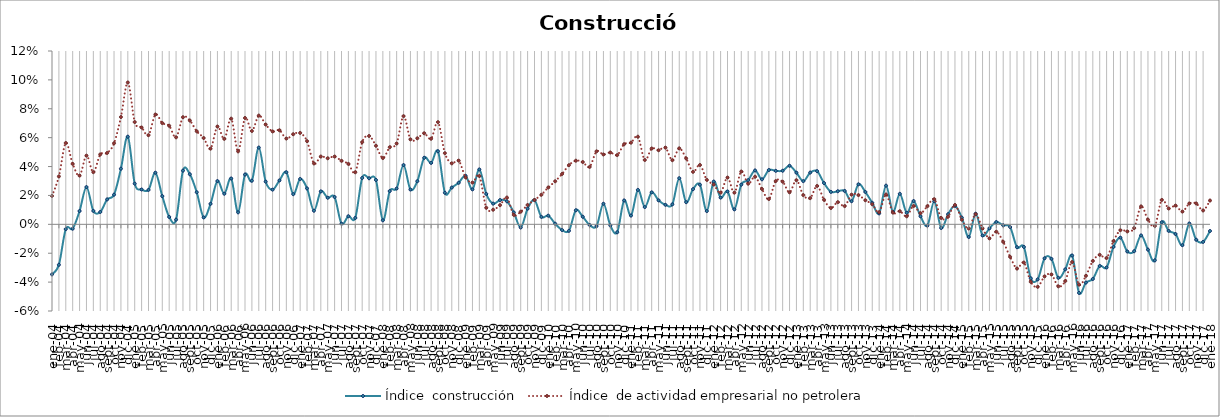
| Category | Índice  construcción | Índice  de actividad empresarial no petrolera |
|---|---|---|
| 2004-01-01 | -0.035 | 0.02 |
| 2004-02-01 | -0.028 | 0.033 |
| 2004-03-01 | -0.003 | 0.056 |
| 2004-04-01 | -0.003 | 0.042 |
| 2004-05-01 | 0.009 | 0.034 |
| 2004-06-01 | 0.026 | 0.048 |
| 2004-07-01 | 0.009 | 0.036 |
| 2004-08-01 | 0.009 | 0.048 |
| 2004-09-01 | 0.017 | 0.049 |
| 2004-10-01 | 0.021 | 0.056 |
| 2004-11-01 | 0.039 | 0.074 |
| 2004-12-01 | 0.061 | 0.098 |
| 2005-01-01 | 0.028 | 0.071 |
| 2005-02-01 | 0.024 | 0.067 |
| 2005-03-01 | 0.024 | 0.062 |
| 2005-04-01 | 0.036 | 0.076 |
| 2005-05-01 | 0.02 | 0.07 |
| 2005-06-01 | 0.005 | 0.068 |
| 2005-07-01 | 0.003 | 0.06 |
| 2005-08-01 | 0.037 | 0.074 |
| 2005-09-01 | 0.035 | 0.072 |
| 2005-10-01 | 0.022 | 0.064 |
| 2005-11-01 | 0.005 | 0.06 |
| 2005-12-01 | 0.014 | 0.052 |
| 2006-01-01 | 0.03 | 0.068 |
| 2006-02-01 | 0.021 | 0.059 |
| 2006-03-01 | 0.032 | 0.073 |
| 2006-04-01 | 0.008 | 0.051 |
| 2006-05-01 | 0.034 | 0.074 |
| 2006-06-01 | 0.03 | 0.065 |
| 2006-07-01 | 0.053 | 0.075 |
| 2006-08-01 | 0.03 | 0.069 |
| 2006-09-01 | 0.024 | 0.064 |
| 2006-10-01 | 0.03 | 0.065 |
| 2006-11-01 | 0.036 | 0.059 |
| 2006-12-01 | 0.021 | 0.062 |
| 2007-01-01 | 0.031 | 0.063 |
| 2007-02-01 | 0.025 | 0.058 |
| 2007-03-01 | 0.009 | 0.042 |
| 2007-04-01 | 0.023 | 0.047 |
| 2007-05-01 | 0.018 | 0.046 |
| 2007-06-01 | 0.019 | 0.047 |
| 2007-07-01 | 0 | 0.044 |
| 2007-08-01 | 0.006 | 0.042 |
| 2007-09-01 | 0.004 | 0.036 |
| 2007-10-01 | 0.032 | 0.057 |
| 2007-11-01 | 0.032 | 0.061 |
| 2007-12-01 | 0.031 | 0.054 |
| 2008-01-01 | 0.003 | 0.046 |
| 2008-02-01 | 0.023 | 0.053 |
| 2008-03-01 | 0.025 | 0.056 |
| 2008-04-01 | 0.041 | 0.075 |
| 2008-05-01 | 0.024 | 0.059 |
| 2008-06-01 | 0.03 | 0.06 |
| 2008-07-01 | 0.046 | 0.063 |
| 2008-08-01 | 0.043 | 0.059 |
| 2008-09-01 | 0.051 | 0.071 |
| 2008-10-01 | 0.022 | 0.049 |
| 2008-11-01 | 0.025 | 0.042 |
| 2008-12-01 | 0.029 | 0.044 |
| 2009-01-01 | 0.034 | 0.033 |
| 2009-02-01 | 0.024 | 0.029 |
| 2009-03-01 | 0.038 | 0.033 |
| 2009-04-01 | 0.021 | 0.012 |
| 2009-05-01 | 0.014 | 0.01 |
| 2009-06-01 | 0.017 | 0.013 |
| 2009-07-01 | 0.016 | 0.019 |
| 2009-08-01 | 0.008 | 0.006 |
| 2009-09-01 | -0.002 | 0.009 |
| 2009-10-01 | 0.011 | 0.013 |
| 2009-11-01 | 0.017 | 0.017 |
| 2009-12-01 | 0.005 | 0.02 |
| 2010-01-01 | 0.006 | 0.026 |
| 2010-02-01 | 0 | 0.03 |
| 2010-03-01 | -0.004 | 0.035 |
| 2010-04-01 | -0.004 | 0.041 |
| 2010-05-01 | 0.01 | 0.044 |
| 2010-06-01 | 0.005 | 0.043 |
| 2010-07-01 | 0 | 0.04 |
| 2010-08-01 | -0.001 | 0.051 |
| 2010-09-01 | 0.014 | 0.048 |
| 2010-10-01 | -0.001 | 0.05 |
| 2010-11-01 | -0.005 | 0.048 |
| 2010-12-01 | 0.017 | 0.055 |
| 2011-01-01 | 0.006 | 0.057 |
| 2011-02-01 | 0.024 | 0.061 |
| 2011-03-01 | 0.012 | 0.045 |
| 2011-04-01 | 0.022 | 0.053 |
| 2011-05-01 | 0.017 | 0.051 |
| 2011-06-01 | 0.014 | 0.053 |
| 2011-07-01 | 0.014 | 0.044 |
| 2011-08-01 | 0.032 | 0.053 |
| 2011-09-01 | 0.015 | 0.046 |
| 2011-10-01 | 0.024 | 0.036 |
| 2011-11-01 | 0.027 | 0.041 |
| 2011-12-01 | 0.009 | 0.031 |
| 2012-01-01 | 0.03 | 0.028 |
| 2012-02-01 | 0.018 | 0.022 |
| 2012-03-01 | 0.023 | 0.032 |
| 2012-04-01 | 0.01 | 0.022 |
| 2012-05-01 | 0.027 | 0.037 |
| 2012-06-01 | 0.031 | 0.028 |
| 2012-07-01 | 0.037 | 0.033 |
| 2012-08-01 | 0.031 | 0.024 |
| 2012-09-01 | 0.038 | 0.018 |
| 2012-10-01 | 0.037 | 0.03 |
| 2012-11-01 | 0.037 | 0.03 |
| 2012-12-01 | 0.041 | 0.022 |
| 2013-01-01 | 0.036 | 0.031 |
| 2013-02-01 | 0.03 | 0.02 |
| 2013-03-01 | 0.036 | 0.018 |
| 2013-04-01 | 0.037 | 0.027 |
| 2013-05-01 | 0.029 | 0.017 |
| 2013-06-01 | 0.022 | 0.011 |
| 2013-07-01 | 0.023 | 0.015 |
| 2013-08-01 | 0.023 | 0.013 |
| 2013-09-01 | 0.016 | 0.021 |
| 2013-10-01 | 0.028 | 0.02 |
| 2013-11-01 | 0.022 | 0.017 |
| 2013-12-01 | 0.015 | 0.014 |
| 2014-01-01 | 0.008 | 0.008 |
| 2014-02-01 | 0.027 | 0.021 |
| 2014-03-01 | 0.009 | 0.008 |
| 2014-04-01 | 0.021 | 0.009 |
| 2014-05-01 | 0.008 | 0.006 |
| 2014-06-01 | 0.016 | 0.013 |
| 2014-07-01 | 0.006 | 0.008 |
| 2014-08-01 | -0.001 | 0.013 |
| 2014-09-01 | 0.016 | 0.017 |
| 2014-10-01 | -0.003 | 0.004 |
| 2014-11-01 | 0.007 | 0.005 |
| 2014-12-01 | 0.013 | 0.013 |
| 2015-01-01 | 0.005 | 0.003 |
| 2015-02-01 | -0.009 | -0.003 |
| 2015-03-01 | 0.007 | 0.007 |
| 2015-04-01 | -0.008 | -0.003 |
| 2015-05-01 | -0.003 | -0.01 |
| 2015-06-01 | 0.002 | -0.005 |
| 2015-07-01 | -0.001 | -0.012 |
| 2015-08-01 | -0.002 | -0.023 |
| 2015-09-01 | -0.016 | -0.031 |
| 2015-10-01 | -0.016 | -0.026 |
| 2015-11-01 | -0.037 | -0.04 |
| 2015-12-01 | -0.038 | -0.043 |
| 2016-01-01 | -0.024 | -0.036 |
| 2016-02-01 | -0.024 | -0.035 |
| 2016-03-01 | -0.037 | -0.043 |
| 2016-04-01 | -0.031 | -0.039 |
| 2016-05-01 | -0.022 | -0.026 |
| 2016-06-01 | -0.047 | -0.042 |
| 2016-07-01 | -0.04 | -0.036 |
| 2016-08-01 | -0.038 | -0.025 |
| 2016-09-01 | -0.029 | -0.021 |
| 2016-10-01 | -0.03 | -0.023 |
| 2016-11-01 | -0.016 | -0.012 |
| 2016-12-01 | -0.009 | -0.004 |
| 2017-01-01 | -0.019 | -0.005 |
| 2017-02-01 | -0.019 | -0.003 |
| 2017-03-01 | -0.008 | 0.012 |
| 2017-04-01 | -0.018 | 0.003 |
| 2017-05-01 | -0.025 | -0.001 |
| 2017-06-01 | 0.001 | 0.017 |
| 2017-07-01 | -0.005 | 0.011 |
| 2017-08-01 | -0.007 | 0.013 |
| 2017-09-01 | -0.014 | 0.009 |
| 2017-10-01 | 0.001 | 0.014 |
| 2017-11-01 | -0.011 | 0.014 |
| 2017-12-01 | -0.012 | 0.01 |
| 2018-01-01 | -0.005 | 0.016 |